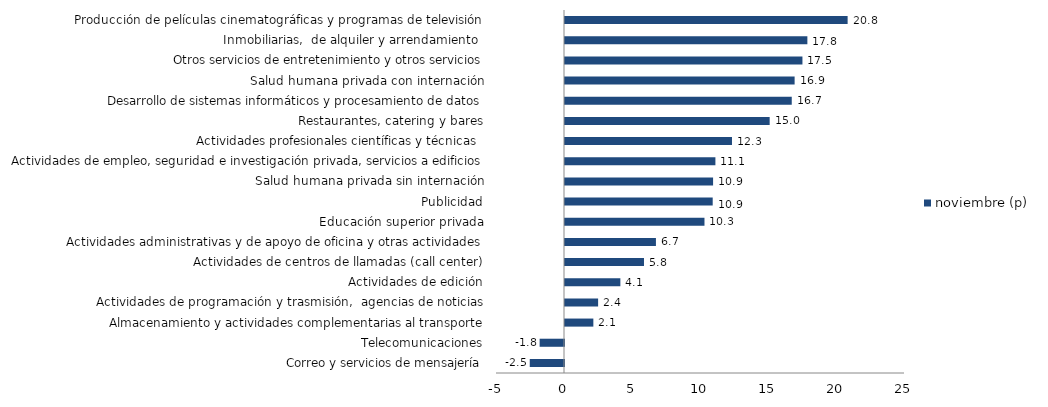
| Category | noviembre (p) |
|---|---|
| Correo y servicios de mensajería | -2.518 |
| Telecomunicaciones | -1.792 |
| Almacenamiento y actividades complementarias al transporte | 2.085 |
| Actividades de programación y trasmisión,  agencias de noticias | 2.435 |
| Actividades de edición | 4.071 |
| Actividades de centros de llamadas (call center) | 5.808 |
| Actividades administrativas y de apoyo de oficina y otras actividades | 6.686 |
| Educación superior privada | 10.256 |
| Publicidad | 10.861 |
| Salud humana privada sin internación | 10.889 |
| Actividades de empleo, seguridad e investigación privada, servicios a edificios | 11.059 |
| Actividades profesionales científicas y técnicas  | 12.278 |
| Restaurantes, catering y bares | 15.049 |
| Desarrollo de sistemas informáticos y procesamiento de datos | 16.673 |
| Salud humana privada con internación | 16.884 |
| Otros servicios de entretenimiento y otros servicios | 17.459 |
| Inmobiliarias,  de alquiler y arrendamiento  | 17.821 |
| Producción de películas cinematográficas y programas de televisión | 20.781 |